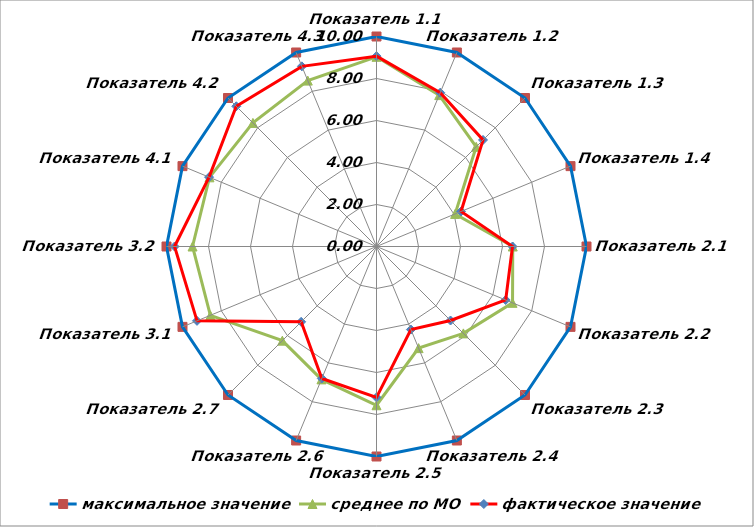
| Category | максимальное значение | среднее по МО | фактическое значение |
|---|---|---|---|
| Показатель 1.1 | 10 | 9.033 | 9.064 |
| Показатель 1.2 | 10 | 7.803 | 7.929 |
| Показатель 1.3 | 10 | 6.713 | 7.174 |
| Показатель 1.4 | 10 | 4.051 | 4.358 |
| Показатель 2.1 | 10 | 6.489 | 6.476 |
| Показатель 2.2 | 10 | 7.011 | 6.659 |
| Показатель 2.3 | 10 | 5.851 | 4.984 |
| Показатель 2.4 | 10 | 5.239 | 4.28 |
| Показатель 2.5 | 10 | 7.56 | 7.185 |
| Показатель 2.6 | 10 | 6.849 | 6.803 |
| Показатель 2.7 | 10 | 6.342 | 5.072 |
| Показатель 3.1 | 10 | 8.563 | 9.251 |
| Показатель 3.2 | 10 | 8.76 | 9.617 |
| Показатель 4.1 | 10 | 8.608 | 8.629 |
| Показатель 4.2 | 10 | 8.323 | 9.443 |
| Показатель 4.3 | 10 | 8.551 | 9.285 |